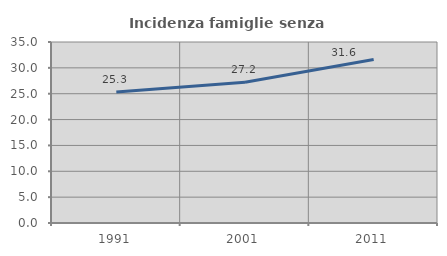
| Category | Incidenza famiglie senza nuclei |
|---|---|
| 1991.0 | 25.332 |
| 2001.0 | 27.203 |
| 2011.0 | 31.634 |